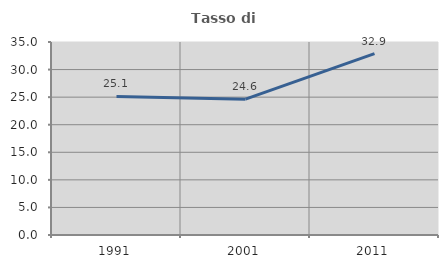
| Category | Tasso di occupazione   |
|---|---|
| 1991.0 | 25.124 |
| 2001.0 | 24.638 |
| 2011.0 | 32.877 |